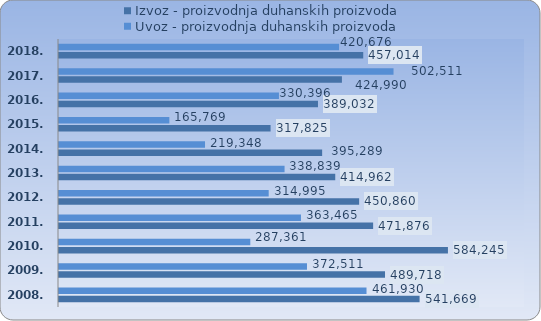
| Category | Izvoz - proizvodnja duhanskih proizvoda | Uvoz - proizvodnja duhanskih proizvoda |
|---|---|---|
| 2008.  | 541669.036 | 461930.043 |
| 2009.  | 489717.667 | 372510.85 |
| 2010.  | 584245.012 | 287360.864 |
| 2011.  | 471876.364 | 363465.04 |
| 2012.  | 450859.694 | 314994.868 |
| 2013.  | 414962.214 | 338838.737 |
| 2014.  | 395289.06 | 219347.944 |
| 2015.  | 317824.81 | 165768.822 |
| 2016.  | 389032.255 | 330395.695 |
| 2017. | 424989.619 | 502511.108 |
| 2018. | 457014.129 | 420675.717 |